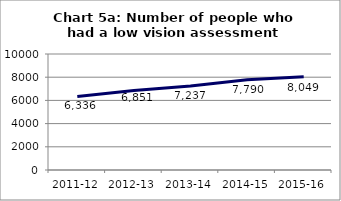
| Category | Chart 5a: Number of people who had a low vision assessment |
|---|---|
| 2011-12 | 6336 |
| 2012-13 | 6851 |
| 2013-14 | 7237 |
| 2014-15 | 7790 |
| 2015-16 | 8049 |